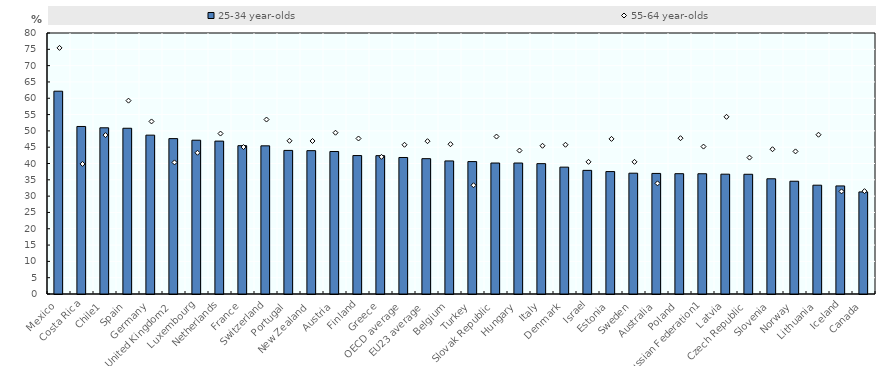
| Category | 25-34 year-olds |
|---|---|
| Mexico | 62.161 |
| Costa Rica | 51.347 |
| Chile1 | 50.94 |
| Spain | 50.804 |
| Germany | 48.689 |
| United Kingdom2 | 47.625 |
| Luxembourg | 47.141 |
| Netherlands | 46.867 |
| France | 45.469 |
| Switzerland | 45.415 |
| Portugal | 44.012 |
| New Zealand | 43.94 |
| Austria | 43.681 |
| Finland | 42.435 |
| Greece | 42.406 |
| OECD average | 41.842 |
| EU23 average | 41.481 |
| Belgium | 40.788 |
| Turkey | 40.585 |
| Slovak Republic | 40.146 |
| Hungary | 40.144 |
| Italy | 39.958 |
| Denmark | 38.88 |
| Israel | 37.897 |
| Estonia | 37.526 |
| Sweden | 37.026 |
| Australia | 36.955 |
| Poland | 36.882 |
| Russian Federation1 | 36.862 |
| Latvia | 36.726 |
| Czech Republic | 36.699 |
| Slovenia | 35.319 |
| Norway | 34.562 |
| Lithuania | 33.35 |
| Iceland | 33.127 |
| Canada | 31.286 |